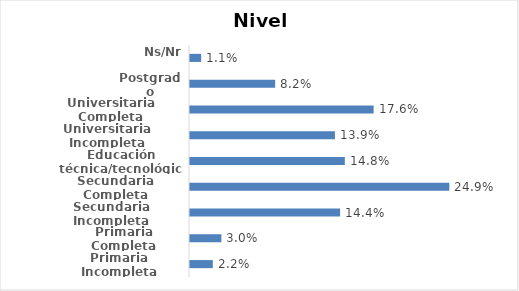
| Category | Series 0 |
|---|---|
| Primaria Incompleta | 0.022 |
| Primaria Completa | 0.03 |
| Secundaria Incompleta | 0.144 |
| Secundaria Completa | 0.249 |
| Educación técnica/tecnológica | 0.148 |
| Universitaria Incompleta | 0.139 |
| Universitaria Completa | 0.176 |
| Postgrado | 0.082 |
| Ns/Nr | 0.011 |